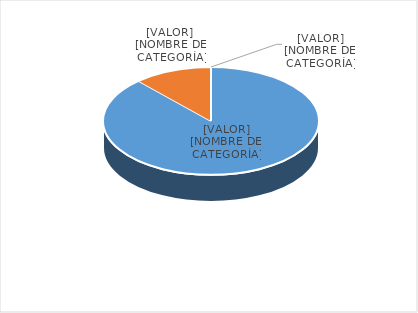
| Category | Series 0 |
|---|---|
| PRESUPUESTO VIGENTE PARA 2023 | 31000000 |
| PRESUPUESTO EJECUTADO  | 4101490.69 |
| PORCENTAJE DE EJECUCIÓN  | 0.132 |